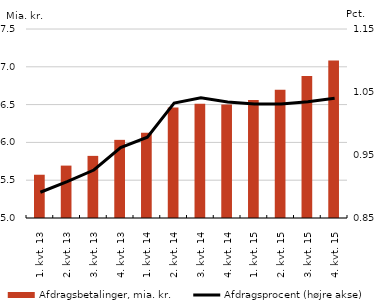
| Category | Afdragsbetalinger, mia. kr. |
|---|---|
| 1. kvt. 13 | 5.572 |
| 2. kvt. 13 | 5.693 |
| 3. kvt. 13 | 5.822 |
| 4. kvt. 13 | 6.034 |
| 1. kvt. 14 | 6.129 |
| 2. kvt. 14 | 6.462 |
| 3. kvt. 14 | 6.51 |
| 4. kvt. 14 | 6.5 |
| 1. kvt. 15 | 6.562 |
| 2. kvt. 15 | 6.695 |
| 3. kvt. 15 | 6.879 |
| 4. kvt. 15 | 7.082 |